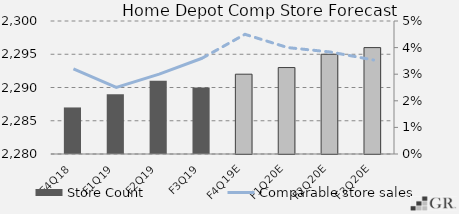
| Category | Store Count  |
|---|---|
|  F4Q18  | 2287 |
|  F1Q19  | 2289 |
|  F2Q19  | 2291 |
|  F3Q19  | 2290 |
|  F4Q19E  | 2292 |
|  F1Q20E  | 2293 |
|  F2Q20E  | 2295 |
|  F3Q20E  | 2296 |